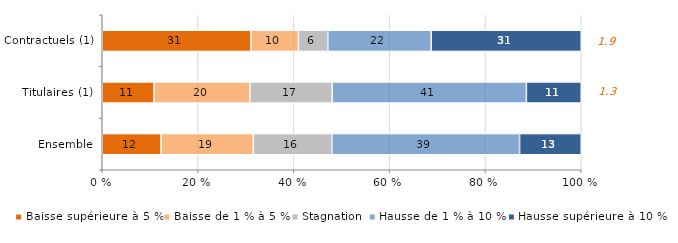
| Category | Baisse supérieure à 5 % | Baisse de 1 % à 5 % | Stagnation | Hausse de 1 % à 10 % | Hausse supérieure à 10 % |
|---|---|---|---|---|---|
| Ensemble | 12.261 | 19.289 | 16.378 | 39.199 | 12.872 |
| Titulaires (1) | 10.819 | 20.008 | 17.167 | 40.553 | 11.453 |
| Contractuels (1) | 31.019 | 9.943 | 6.12 | 21.589 | 31.329 |